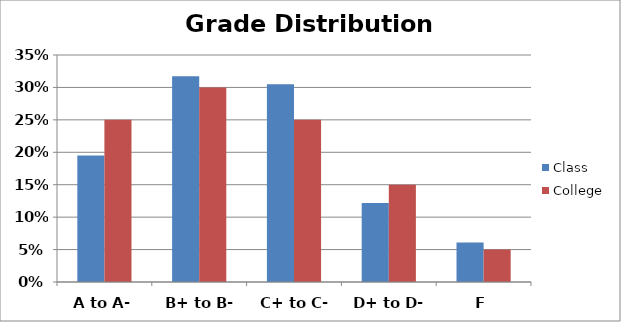
| Category | Class | College |
|---|---|---|
| A to A- | 0.195 | 0.25 |
| B+ to B- | 0.317 | 0.3 |
| C+ to C- | 0.305 | 0.25 |
| D+ to D- | 0.122 | 0.15 |
| F | 0.061 | 0.05 |